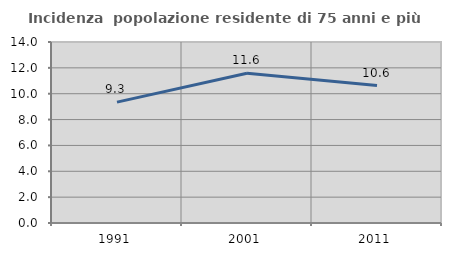
| Category | Incidenza  popolazione residente di 75 anni e più |
|---|---|
| 1991.0 | 9.347 |
| 2001.0 | 11.583 |
| 2011.0 | 10.634 |